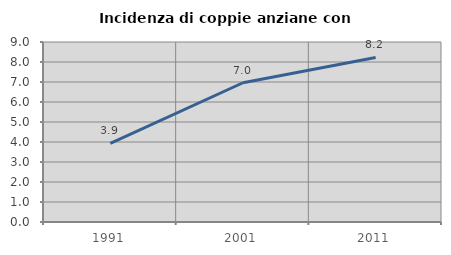
| Category | Incidenza di coppie anziane con figli |
|---|---|
| 1991.0 | 3.933 |
| 2001.0 | 6.962 |
| 2011.0 | 8.228 |